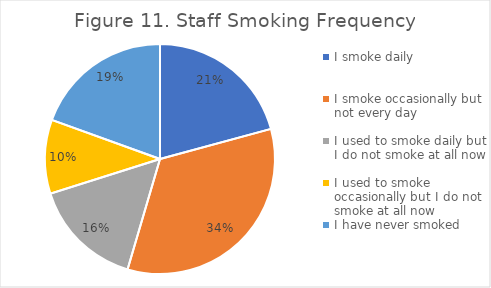
| Category | Series 0 |
|---|---|
| I smoke daily | 0.208 |
| I smoke occasionally but not every day | 0.338 |
| I used to smoke daily but I do not smoke at all now | 0.156 |
| I used to smoke occasionally but I do not smoke at all now | 0.104 |
| I have never smoked | 0.195 |